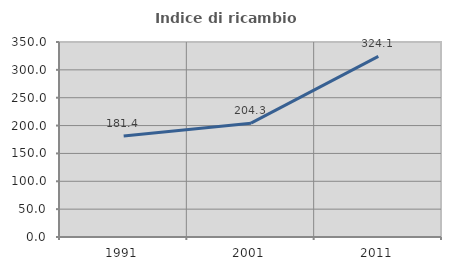
| Category | Indice di ricambio occupazionale  |
|---|---|
| 1991.0 | 181.356 |
| 2001.0 | 204.278 |
| 2011.0 | 324.096 |